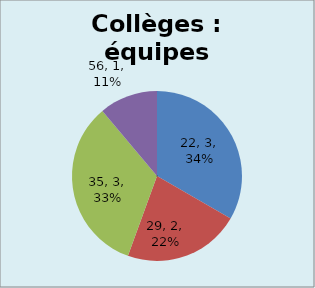
| Category | Collèges |
|---|---|
| 22.0 | 3 |
| 29.0 | 2 |
| 35.0 | 3 |
| 56.0 | 1 |